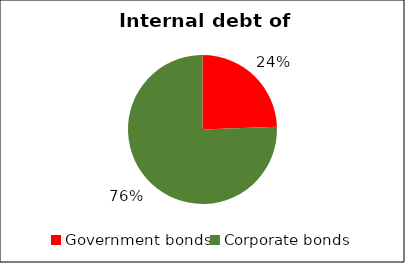
| Category | Domestic bond market volume |
|---|---|
| Government bonds | 0.98 |
| Corporate bonds | 3.037 |